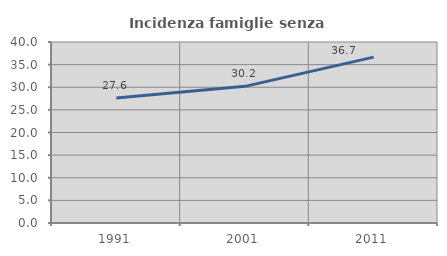
| Category | Incidenza famiglie senza nuclei |
|---|---|
| 1991.0 | 27.606 |
| 2001.0 | 30.198 |
| 2011.0 | 36.651 |